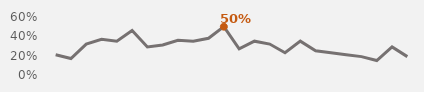
| Category | Tuesday |
|---|---|
| 1994.0 | 0.21 |
| 1995.0 | 0.17 |
| 1996.0 | 0.32 |
| 1997.0 | 0.37 |
| 1998.0 | 0.35 |
| 1999.0 | 0.46 |
| 2000.0 | 0.29 |
| 2001.0 | 0.31 |
| 2002.0 | 0.36 |
| 2003.0 | 0.35 |
| 2004.0 | 0.38 |
| 2005.0 | 0.5 |
| 2006.0 | 0.27 |
| 2007.0 | 0.35 |
| 2008.0 | 0.32 |
| 2009.0 | 0.23 |
| 2010.0 | 0.35 |
| 2011.0 | 0.25 |
| 2012.0 | 0.23 |
| 2013.0 | 0.21 |
| 2014.0 | 0.19 |
| 2015.0 | 0.15 |
| 2016.0 | 0.29 |
| 2017.0 | 0.19 |